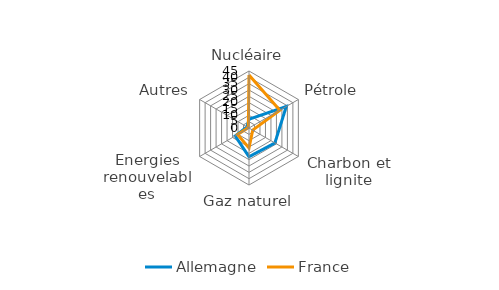
| Category | Allemagne | France |
|---|---|---|
| Nucléaire | 6.9 | 41.9 |
| Pétrole | 34 | 28.1 |
| Charbon et lignite | 23.6 | 3.4 |
| Gaz naturel | 22.7 | 15.7 |
| Energies renouvelables | 12.6 | 10.4 |
| Autres | 1.8 | 0.6 |